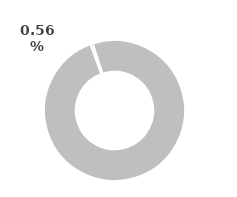
| Category | Series 0 |
|---|---|
| 0 | 0.006 |
| 1 | 0.994 |